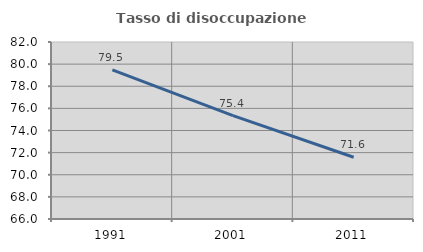
| Category | Tasso di disoccupazione giovanile  |
|---|---|
| 1991.0 | 79.486 |
| 2001.0 | 75.351 |
| 2011.0 | 71.583 |